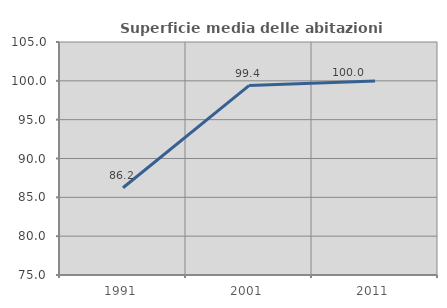
| Category | Superficie media delle abitazioni occupate |
|---|---|
| 1991.0 | 86.229 |
| 2001.0 | 99.39 |
| 2011.0 | 99.982 |